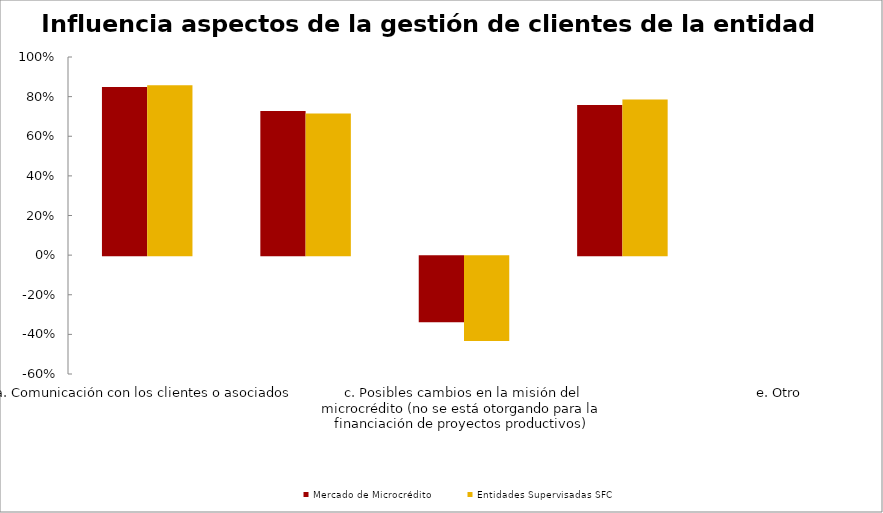
| Category | Mercado de Microcrédito | Entidades Supervisadas SFC |
|---|---|---|
| a. Comunicación con los clientes o asociados | 0.848 | 0.857 |
| b. Desarrollo de productos adecuados para los clientes o asociados | 0.727 | 0.714 |
| c. Posibles cambios en la misión del microcrédito (no se está otorgando para la financiación de proyectos productivos) | -0.333 | -0.429 |
| d. Apoyo del asesor de microcrédito | 0.758 | 0.786 |
| e. Otro | 0 | 0 |